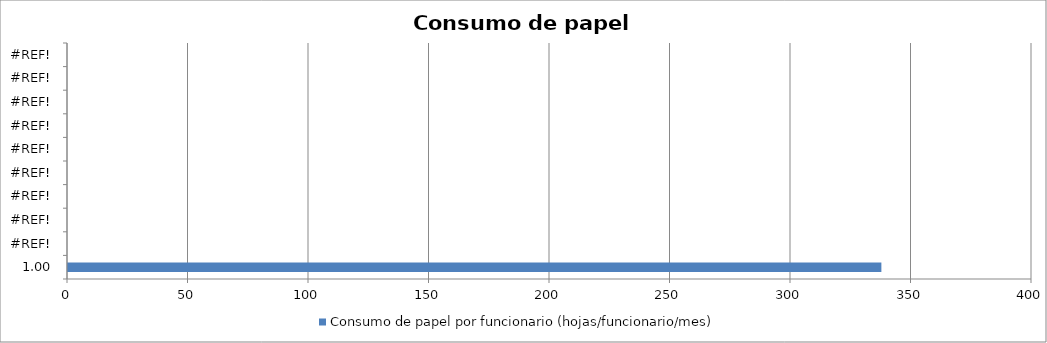
| Category | Consumo de papel por funcionario (hojas/funcionario/mes) |
|---|---|
| 1.0 | 337.5 |
| 0.0 | 0 |
| 0.0 | 0 |
| 0.0 | 0 |
| 0.0 | 0 |
| 0.0 | 0 |
| 0.0 | 0 |
| 0.0 | 0 |
| 0.0 | 0 |
| 0.0 | 0 |